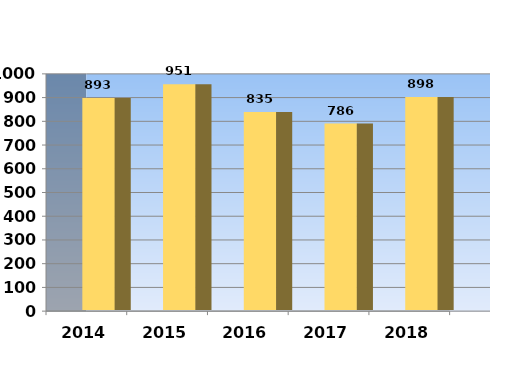
| Category | Series 0 |
|---|---|
| 2014.0 | 893 |
| 2015.0 | 951 |
| 2016.0 | 835 |
| 2017.0 | 786 |
| 2018.0 | 898 |